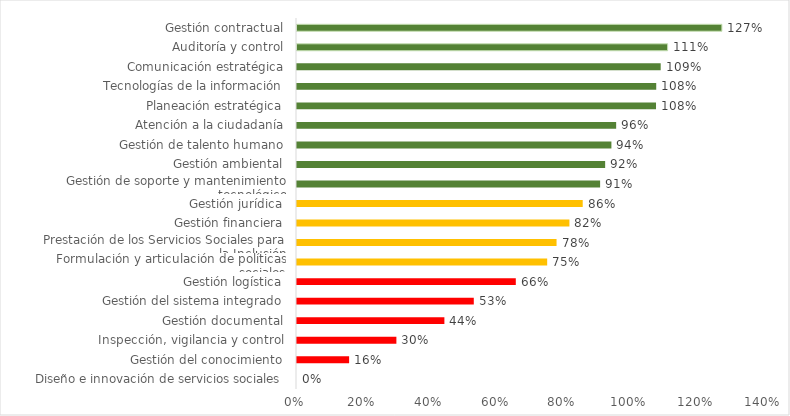
| Category | Series 0 |
|---|---|
| Diseño e innovación de servicios sociales | 0 |
| Gestión del conocimiento | 0.156 |
| Inspección, vigilancia y control | 0.298 |
| Gestión documental | 0.442 |
| Gestión del sistema integrado | 0.53 |
| Gestión logística | 0.656 |
| Formulación y articulación de políticas sociales | 0.75 |
| Prestación de los Servicios Sociales para la Inclusión | 0.778 |
| Gestión financiera | 0.817 |
| Gestión jurídica | 0.857 |
| Gestión de soporte y mantenimiento tecnológico | 0.909 |
| Gestión ambiental | 0.924 |
| Gestión de talento humano | 0.943 |
| Atención a la ciudadanía | 0.957 |
| Planeación estratégica | 1.076 |
| Tecnologías de la información | 1.077 |
| Comunicación estratégica | 1.09 |
| Auditoría y control | 1.111 |
| Gestión contractual | 1.274 |